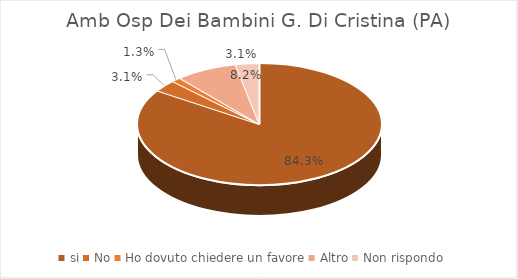
| Category | Amb Osp Dei Bambini G. Di Cristina (PA) |
|---|---|
| si | 0.843 |
| No | 0.031 |
| Ho dovuto chiedere un favore | 0.013 |
| Altro | 0.082 |
| Non rispondo | 0.031 |